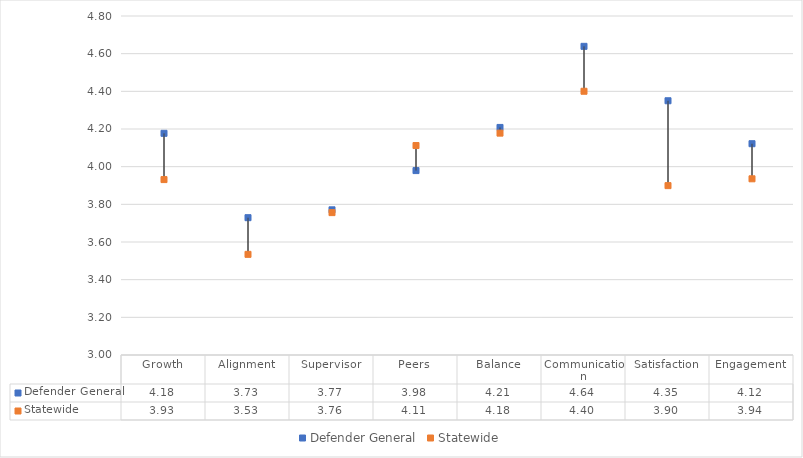
| Category | Defender General | Statewide |
|---|---|---|
| Growth | 4.177 | 3.931 |
| Alignment | 3.729 | 3.534 |
| Supervisor | 3.771 | 3.756 |
| Peers | 3.979 | 4.112 |
| Balance | 4.208 | 4.178 |
| Communication | 4.639 | 4.4 |
| Satisfaction | 4.35 | 3.899 |
| Engagement | 4.122 | 3.936 |